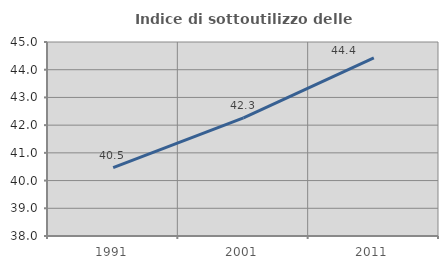
| Category | Indice di sottoutilizzo delle abitazioni  |
|---|---|
| 1991.0 | 40.464 |
| 2001.0 | 42.266 |
| 2011.0 | 44.424 |